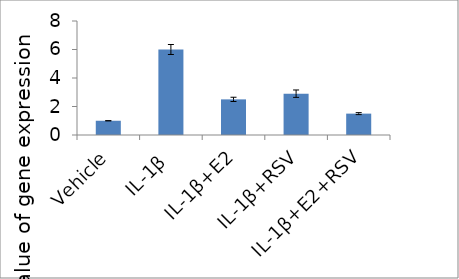
| Category | Series 0 |
|---|---|
| Vehicle | 1 |
| IL-1β | 6 |
| IL-1β+E2 | 2.5 |
| IL-1β+RSV | 2.9 |
| IL-1β+E2+RSV | 1.5 |